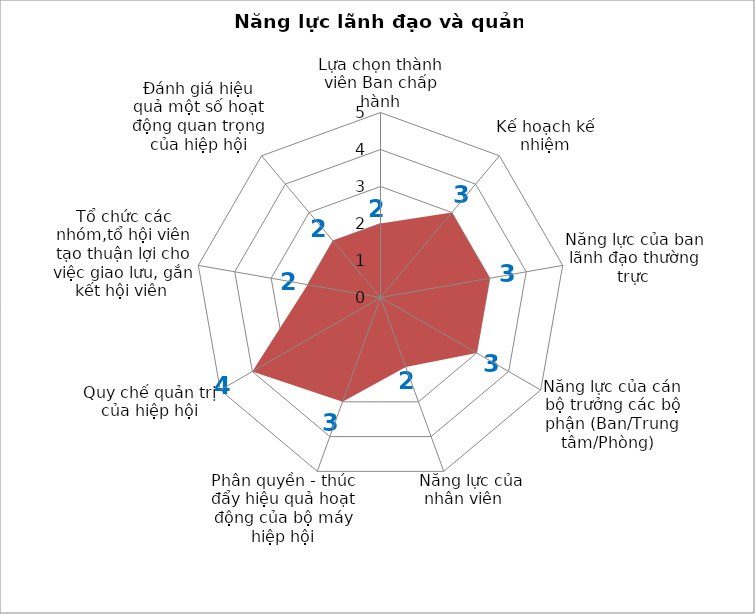
| Category | Series 0 |
|---|---|
| Lựa chọn thành viên Ban chấp hành | 2 |
| Kế hoạch kế nhiệm | 3 |
| Năng lực của ban lãnh đạo thường trực  | 3 |
| Năng lực của cán bộ trưởng các bộ phận (Ban/Trung tâm/Phòng)   | 3 |
|  Năng lực của nhân viên   | 2 |
| Phân quyền - thúc đẩy hiệu quả hoạt động của bộ máy hiệp hội | 3 |
| Quy chế quản trị của hiệp hội | 4 |
| Tổ chức các nhóm,tổ hội viên tạo thuận lợi cho việc giao lưu, gắn kết hội viên  | 2 |
| Đánh giá hiệu quả một số hoạt động quan trọng của hiệp hội | 2 |